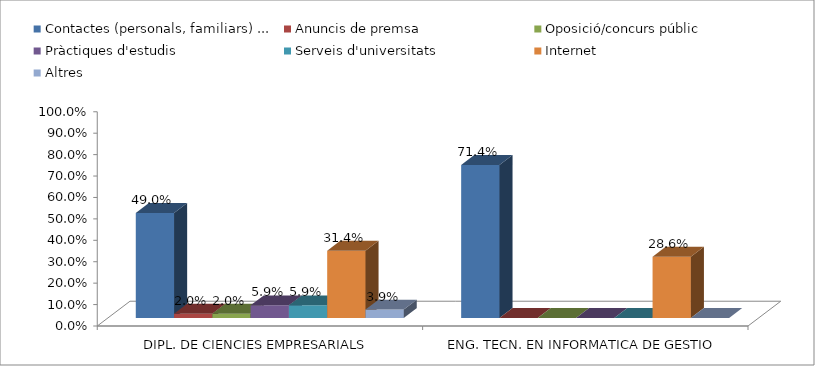
| Category | Contactes (personals, familiars) ... | Anuncis de premsa | Oposició/concurs públic | Pràctiques d'estudis | Serveis d'universitats | Internet | Altres |
|---|---|---|---|---|---|---|---|
| DIPL. DE CIENCIES EMPRESARIALS | 0.49 | 0.02 | 0.02 | 0.059 | 0.059 | 0.314 | 0.039 |
| ENG. TECN. EN INFORMATICA DE GESTIO | 0.714 | 0 | 0 | 0 | 0 | 0.286 | 0 |